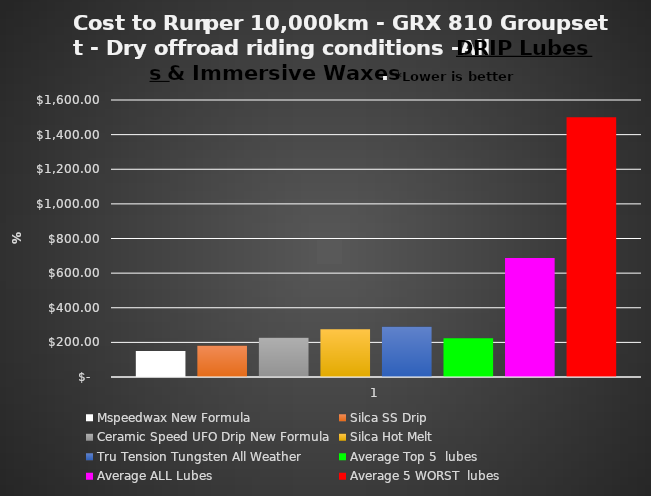
| Category | Mspeedwax New Formula | Silca SS Drip | Ceramic Speed UFO Drip New Formula | Silca Hot Melt | Tru Tension Tungsten All Weather | Average Top 5  lubes | Average ALL Lubes | Average 5 WORST  lubes |
|---|---|---|---|---|---|---|---|---|
| 0 | 149.85 | 180.47 | 226.65 | 275.85 | 289.75 | 224.51 | 687.1 | 1500 |